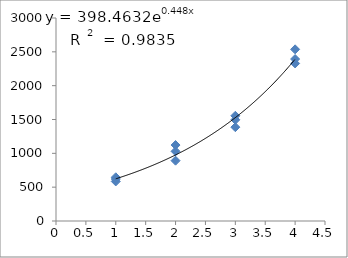
| Category | Series 0 |
|---|---|
| 1.0 | 584.502 |
| 1.0 | 645.965 |
| 1.0 | 620.657 |
| 2.0 | 1122.617 |
| 2.0 | 1029.566 |
| 2.0 | 891.49 |
| 3.0 | 1386.507 |
| 3.0 | 1495.447 |
| 3.0 | 1554.869 |
| 4.0 | 2393.4 |
| 4.0 | 2536.734 |
| 4.0 | 2328.494 |